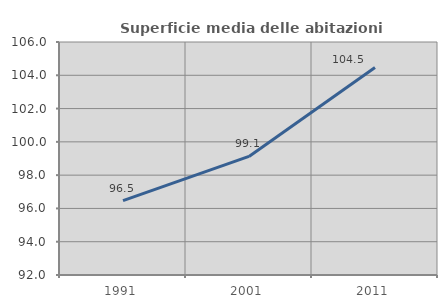
| Category | Superficie media delle abitazioni occupate |
|---|---|
| 1991.0 | 96.469 |
| 2001.0 | 99.124 |
| 2011.0 | 104.465 |